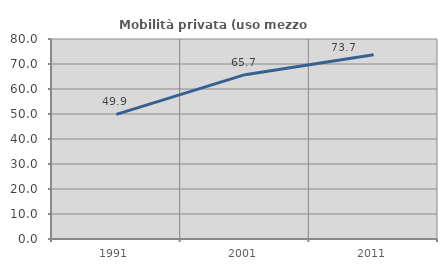
| Category | Mobilità privata (uso mezzo privato) |
|---|---|
| 1991.0 | 49.85 |
| 2001.0 | 65.728 |
| 2011.0 | 73.694 |